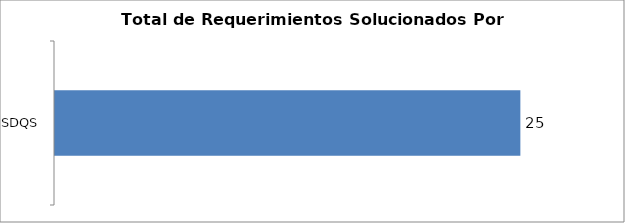
| Category | Total |
|---|---|
| SDQS | 21 |